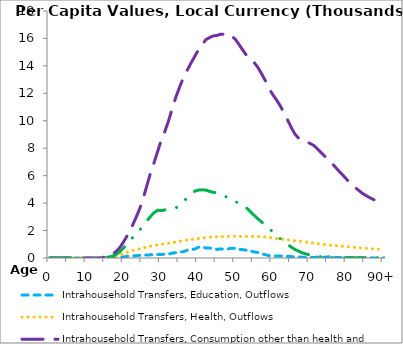
| Category | Intrahousehold Transfers, Education, Outflows | Intrahousehold Transfers, Health, Outflows | Intrahousehold Transfers, Consumption other than health and education, Outflows | Intrahousehold Transfers, Saving, Outflows |
|---|---|---|---|---|
| 0 | 0 | 0 | 0 | 0 |
|  | 0 | 0 | 0 | 0 |
| 2 | 0 | 0 | 0 | 0 |
| 3 | 0 | 0 | 0 | 0 |
| 4 | 0 | 0 | 0 | 0 |
| 5 | 0 | 0 | 0 | 0 |
| 6 | 0 | 0 | 0 | 0 |
| 7 | 0 | 0 | 0 | 0 |
| 8 | 0 | 0 | 0 | 0 |
| 9 | 0 | 0 | 0 | 0 |
| 10 | 0 | 0 | 0 | 0 |
| 11 | 0 | 0 | 0 | 0 |
| 12 | 0 | 0 | 0 | 0 |
| 13 | 0 | 0 | 0 | 0 |
| 14 | 0 | 0 | 0 | 0 |
| 15 | 1.449 | 17.151 | 122.794 | 39.844 |
| 16 | 3.631 | 34.553 | 120.29 | 77.717 |
| 17 | 9.098 | 69.611 | 305.957 | 151.59 |
| 18 | 20.378 | 132.845 | 511.699 | 284.298 |
| 19 | 46.837 | 222.315 | 825.078 | 494.024 |
| 20 | 81.249 | 329.58 | 1243.803 | 785.559 |
| 21 | 125.024 | 427.397 | 1711.285 | 1093.584 |
| 22 | 154.822 | 522.903 | 2231.49 | 1405.585 |
| 23 | 158.757 | 591.963 | 2825.519 | 1686.546 |
| 24 | 189.884 | 657.226 | 3460.57 | 1965.513 |
| 25 | 202.9 | 717.681 | 4196.765 | 2308.809 |
| 26 | 210.576 | 795.502 | 5170.699 | 2654.082 |
| 27 | 229.206 | 858.847 | 6104.777 | 3004.228 |
| 28 | 239.499 | 912.546 | 6903.45 | 3283.112 |
| 29 | 251.117 | 958.972 | 7748.194 | 3481.269 |
| 30 | 256.473 | 1003.991 | 8590.816 | 3452.164 |
| 31 | 281.291 | 1033.577 | 9245.978 | 3508.56 |
| 32 | 291.251 | 1075.735 | 10039.849 | 3550.418 |
| 33 | 356.842 | 1126.746 | 10943.42 | 3581.957 |
| 34 | 389.385 | 1176.982 | 11783.264 | 3657.568 |
| 35 | 429.646 | 1225.46 | 12499.684 | 3867.272 |
| 36 | 460.702 | 1274.848 | 13171.595 | 4134.795 |
| 37 | 570.122 | 1313.277 | 13691.148 | 4381.25 |
| 38 | 602.956 | 1353.687 | 14210.214 | 4670.46 |
| 39 | 653.99 | 1390.362 | 14683.858 | 4870.135 |
| 40 | 785.121 | 1422.141 | 15162.363 | 4949.664 |
| 41 | 793.711 | 1452.704 | 15531.728 | 4967.397 |
| 42 | 735.673 | 1484.461 | 15911.49 | 4949.844 |
| 43 | 721.528 | 1505.095 | 16064.06 | 4854.688 |
| 44 | 691.826 | 1527.433 | 16185.279 | 4787.612 |
| 45 | 622.561 | 1542.613 | 16218.661 | 4747.034 |
| 46 | 667.362 | 1554.744 | 16313.883 | 4624.755 |
| 47 | 637 | 1561.002 | 16307.037 | 4498.689 |
| 48 | 665.195 | 1574.033 | 16346.379 | 4427.602 |
| 49 | 719.104 | 1572.034 | 16163.743 | 4284.056 |
| 50 | 697.238 | 1575.216 | 15915.34 | 4099.089 |
| 51 | 618.417 | 1572.042 | 15531.329 | 3985.199 |
| 52 | 608.354 | 1571.971 | 15130.608 | 3842.306 |
| 53 | 562.412 | 1565.862 | 14744.338 | 3635.215 |
| 54 | 497.564 | 1569.964 | 14511.305 | 3383.507 |
| 55 | 444.264 | 1571.779 | 14243.779 | 3113.931 |
| 56 | 405.697 | 1566.019 | 13891.447 | 2857.394 |
| 57 | 297.736 | 1550.455 | 13427.713 | 2633.561 |
| 58 | 244.615 | 1530.142 | 12935.068 | 2324.245 |
| 59 | 173.238 | 1496.657 | 12351.76 | 2145.042 |
| 60 | 149.275 | 1462.184 | 11916.228 | 1913.478 |
| 61 | 149.188 | 1425.463 | 11527.784 | 1704.276 |
| 62 | 142.526 | 1388.753 | 11105.602 | 1400.004 |
| 63 | 150.658 | 1351.083 | 10599.695 | 1215.529 |
| 64 | 118.082 | 1322.587 | 10064.278 | 991.347 |
| 65 | 103.337 | 1291.896 | 9506.541 | 797.764 |
| 66 | 71.725 | 1260.36 | 9018.179 | 617.885 |
| 67 | 77.844 | 1231.051 | 8725.818 | 494.266 |
| 68 | 61.521 | 1207.128 | 8563.706 | 373.55 |
| 69 | 61.03 | 1165.769 | 8472.071 | 290.811 |
| 70 | 37.976 | 1125.291 | 8352.232 | 223.857 |
| 71 | 37.584 | 1087.189 | 8212.836 | 175.451 |
| 72 | 59.989 | 1049.012 | 7966.557 | 130.342 |
| 73 | 54.272 | 1009.942 | 7693.281 | 95.83 |
| 74 | 53.169 | 979.57 | 7420.245 | 67.046 |
| 75 | 86.716 | 952.618 | 7167.925 | 48.913 |
| 76 | 74.656 | 925.43 | 6879.535 | 34.612 |
| 77 | 40.336 | 898.263 | 6583.456 | 26.856 |
| 78 | 31.246 | 871.746 | 6281.565 | 22.019 |
| 79 | 30.942 | 845.735 | 6005.183 | 17.654 |
| 80 | 30.797 | 820.478 | 5706.197 | 14.595 |
| 81 | 29.922 | 796.462 | 5420.572 | 12.751 |
| 82 | 35.034 | 773.895 | 5182.653 | 11.232 |
| 83 | 28.42 | 751.968 | 4960.231 | 9.961 |
| 84 | 21.416 | 730.662 | 4741.538 | 9.852 |
| 85 | 12.555 | 709.96 | 4569.967 | 9.826 |
| 86 | 11.643 | 689.844 | 4417.189 | 9.813 |
| 87 | 8.327 | 670.298 | 4276.683 | 9.809 |
| 88 | 4.532 | 651.306 | 4142.739 | 9.809 |
| 89 | 2.974 | 632.852 | 4010.571 | 9.809 |
| 90+ | 1.951 | 614.922 | 3883.469 | 9.809 |